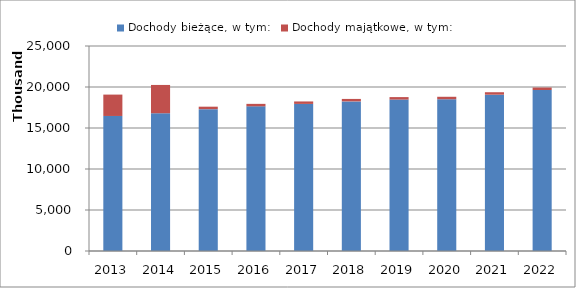
| Category | Dochody bieżące, w tym: | Dochody majątkowe, w tym: |
|---|---|---|
| 2013.0 | 16467129.5 | 2606760.25 |
| 2014.0 | 16800000 | 3450344 |
| 2015.0 | 17300000 | 300000 |
| 2016.0 | 17643950 | 300000 |
| 2017.0 | 17937269 | 300000 |
| 2018.0 | 18245387 | 300000 |
| 2019.0 | 18468748 | 300000 |
| 2020.0 | 18507811 | 300000 |
| 2021.0 | 19063045 | 300000 |
| 2022.0 | 19634936 | 300000 |